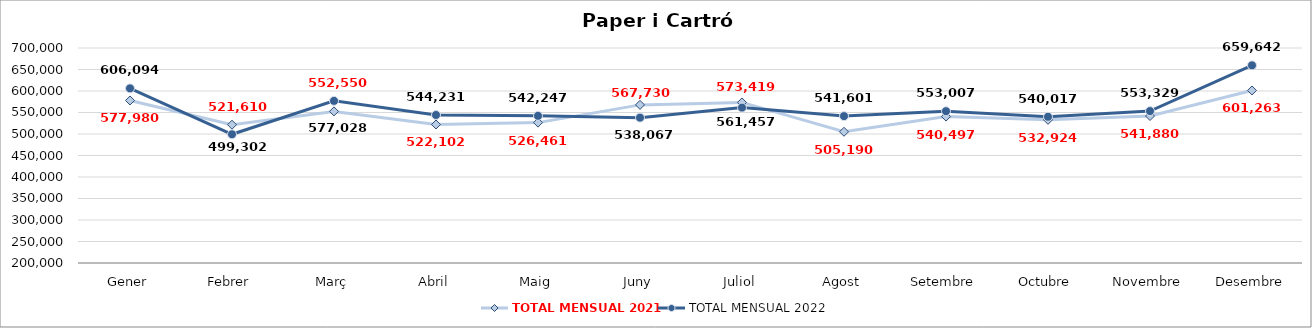
| Category | TOTAL MENSUAL 2021 | TOTAL MENSUAL 2022 |
|---|---|---|
| Gener | 577980 | 606094.2 |
| Febrer | 521609.99 | 499302.4 |
| Març | 552550 | 577027.8 |
| Abril | 522102 | 544231.408 |
| Maig | 526460.98 | 542247.222 |
| Juny | 567729.97 | 538066.8 |
| Juliol | 573418.98 | 561457.2 |
| Agost | 505190.02 | 541601.063 |
| Setembre | 540496.64 | 553007.051 |
| Octubre | 532923.99 | 540016.985 |
| Novembre | 541879.51 | 553328.508 |
| Desembre | 601263 | 659641.971 |